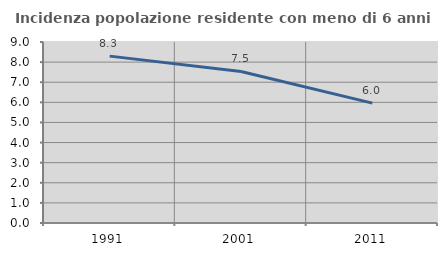
| Category | Incidenza popolazione residente con meno di 6 anni |
|---|---|
| 1991.0 | 8.298 |
| 2001.0 | 7.535 |
| 2011.0 | 5.959 |